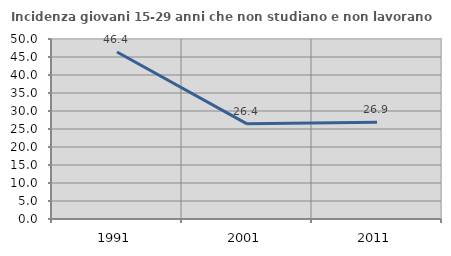
| Category | Incidenza giovani 15-29 anni che non studiano e non lavorano  |
|---|---|
| 1991.0 | 46.403 |
| 2001.0 | 26.426 |
| 2011.0 | 26.859 |